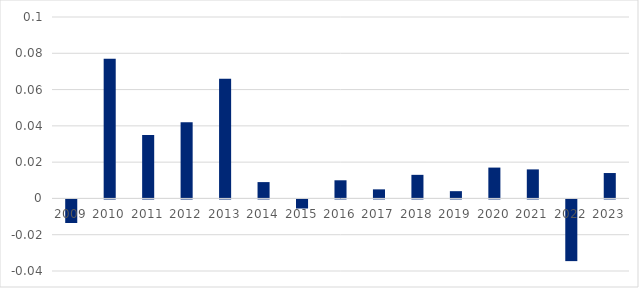
| Category | Series 0 |
|---|---|
| 2009.0 | -0.013 |
| 2010.0 | 0.077 |
| 2011.0 | 0.035 |
| 2012.0 | 0.042 |
| 2013.0 | 0.066 |
| 2014.0 | 0.009 |
| 2015.0 | -0.005 |
| 2016.0 | 0.01 |
| 2017.0 | 0.005 |
| 2018.0 | 0.013 |
| 2019.0 | 0.004 |
| 2020.0 | 0.017 |
| 2021.0 | 0.016 |
| 2022.0 | -0.034 |
| 2023.0 | 0.014 |